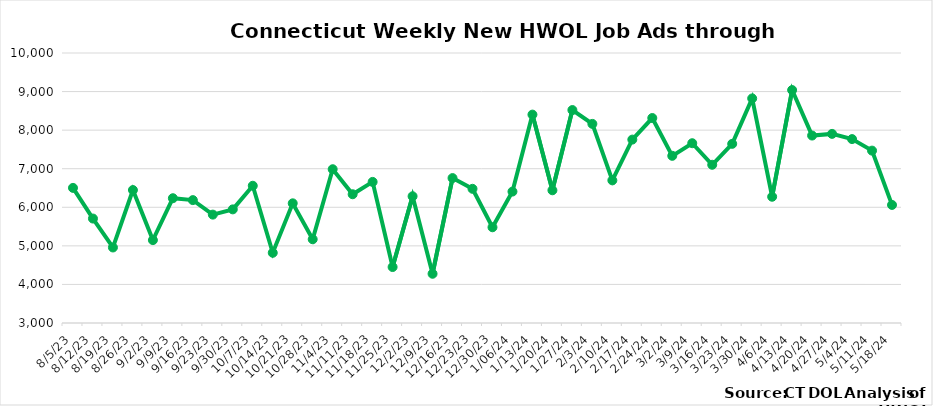
| Category | Connecticut |
|---|---|
| 8/5/23 | 6503 |
| 8/12/23 | 5708 |
| 8/19/23 | 4958 |
| 8/26/23 | 6447 |
| 9/2/23 | 5149 |
| 9/9/23 | 6235 |
| 9/16/23 | 6186 |
| 9/23/23 | 5810 |
| 9/30/23 | 5946 |
| 10/7/23 | 6558 |
| 10/14/23 | 4820 |
| 10/21/23 | 6103 |
| 10/28/23 | 5171 |
| 11/4/23 | 6987 |
| 11/11/23 | 6338 |
| 11/18/23 | 6658 |
| 11/25/23 | 4451 |
| 12/2/23 | 6286 |
| 12/9/23 | 4276 |
| 12/16/23 | 6757 |
|  12/23/23 | 6479 |
|  12/30/23 | 5482 |
|  1/06/24 | 6407 |
|  1/13/24 | 8403 |
|  1/20/24 | 6441 |
|  1/27/24 | 8521 |
|  2/3/24 | 8162 |
|  2/10/24 | 6698 |
|  2/17/24 | 7755 |
|  2/24/24 | 8314 |
|  3/2/24 | 7334 |
|  3/9/24 | 7661 |
|  3/16/24 | 7102 |
|  3/23/24 | 7645 |
|  3/30/24 | 8822 |
|  4/6/24 | 6273 |
|  4/13/24 | 9039 |
|  4/20/24 | 7860 |
|  4/27/24 | 7903 |
|  5/4/24 | 7768 |
|  5/11/24 | 7469 |
|  5/18/24 | 6061 |